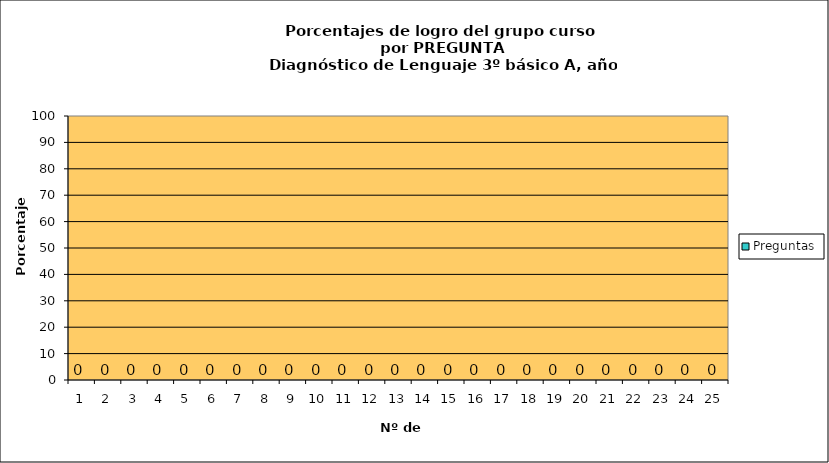
| Category | Preguntas |
|---|---|
| 0 | 0 |
| 1 | 0 |
| 2 | 0 |
| 3 | 0 |
| 4 | 0 |
| 5 | 0 |
| 6 | 0 |
| 7 | 0 |
| 8 | 0 |
| 9 | 0 |
| 10 | 0 |
| 11 | 0 |
| 12 | 0 |
| 13 | 0 |
| 14 | 0 |
| 15 | 0 |
| 16 | 0 |
| 17 | 0 |
| 18 | 0 |
| 19 | 0 |
| 20 | 0 |
| 21 | 0 |
| 22 | 0 |
| 23 | 0 |
| 24 | 0 |